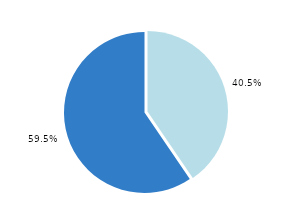
| Category | Series 0 |
|---|---|
| 0 | 3500 |
| 1 | 5144 |